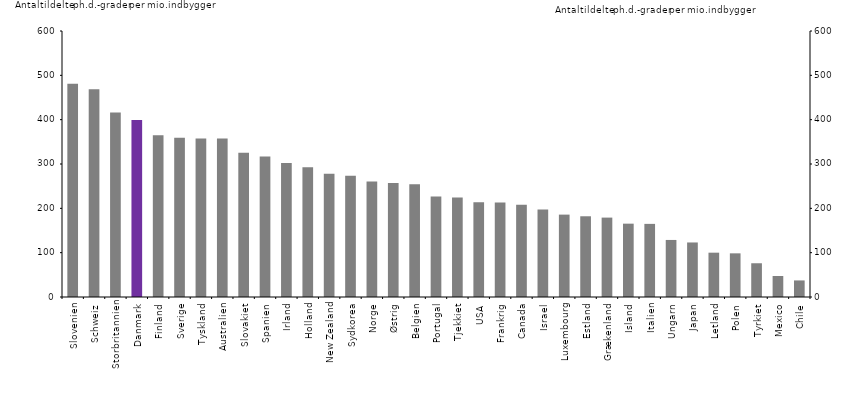
| Category | Antal ph.d.-grader per mio. indbyggere |
|---|---|
| Slovenien | 481.264 |
| Schweiz | 468.355 |
| Storbritannien | 415.969 |
| Danmark | 398.994 |
| Finland | 365.065 |
| Sverige | 359.135 |
| Tyskland | 357.726 |
| Australien | 357.583 |
| Slovakiet | 325.299 |
| Spanien | 317.039 |
| Irland | 302.365 |
| Holland | 292.394 |
| New Zealand | 278.062 |
| Sydkorea | 273.311 |
| Norge | 260.339 |
| Østrig | 256.998 |
| Belgien | 254.438 |
| Portugal | 226.676 |
| Tjekkiet | 224.202 |
| USA | 213.927 |
| Frankrig | 213.023 |
| Canada | 207.94 |
| Israel | 197.392 |
| Luxembourg | 185.846 |
| Estland | 182.103 |
| Grækenland | 179.1 |
| Island | 165.426 |
| Italien | 164.951 |
| Ungarn | 128.675 |
| Japan | 123.007 |
| Letland | 99.973 |
| Polen | 98.471 |
| Tyrkiet | 76.114 |
| Mexico | 47.436 |
| Chile | 37.382 |